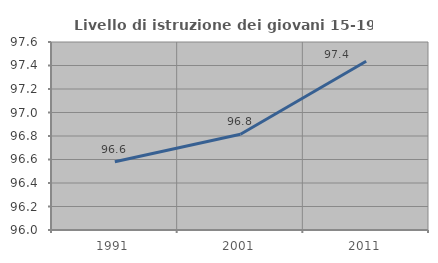
| Category | Livello di istruzione dei giovani 15-19 anni |
|---|---|
| 1991.0 | 96.581 |
| 2001.0 | 96.815 |
| 2011.0 | 97.436 |